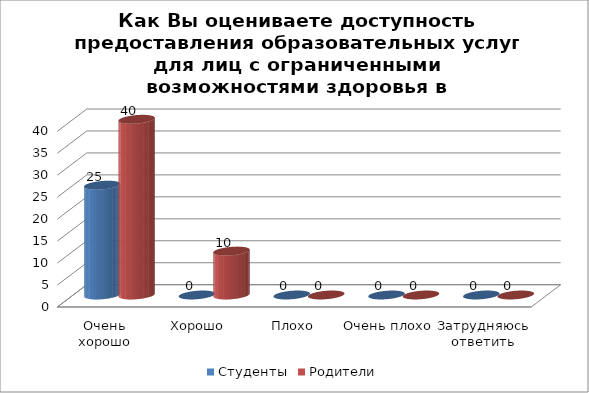
| Category | Студенты | Родители |
|---|---|---|
| Очень хорошо | 25 | 40 |
| Хорошо | 0 | 10 |
| Плохо | 0 | 0 |
| Очень плохо | 0 | 0 |
| Затрудняюсь ответить | 0 | 0 |